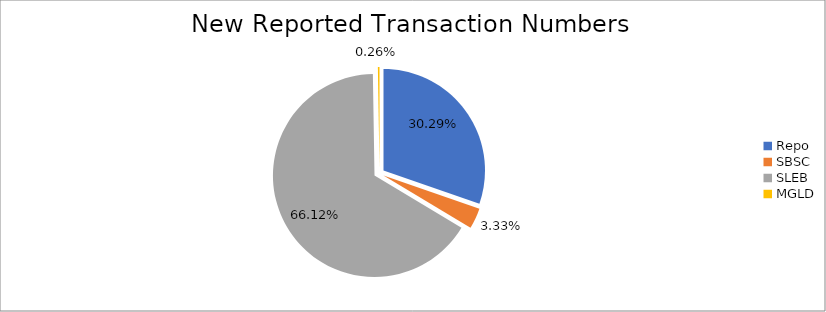
| Category | Series 0 |
|---|---|
| Repo | 411913 |
| SBSC | 45227 |
| SLEB | 899052 |
| MGLD | 3496 |